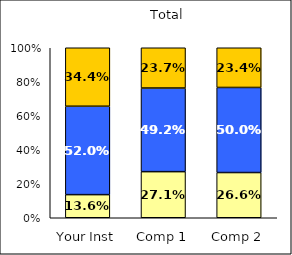
| Category | Low Leadership | Average Leadership | High Leadership |
|---|---|---|---|
| Your Inst | 0.136 | 0.52 | 0.344 |
| Comp 1 | 0.271 | 0.492 | 0.237 |
| Comp 2 | 0.266 | 0.5 | 0.234 |